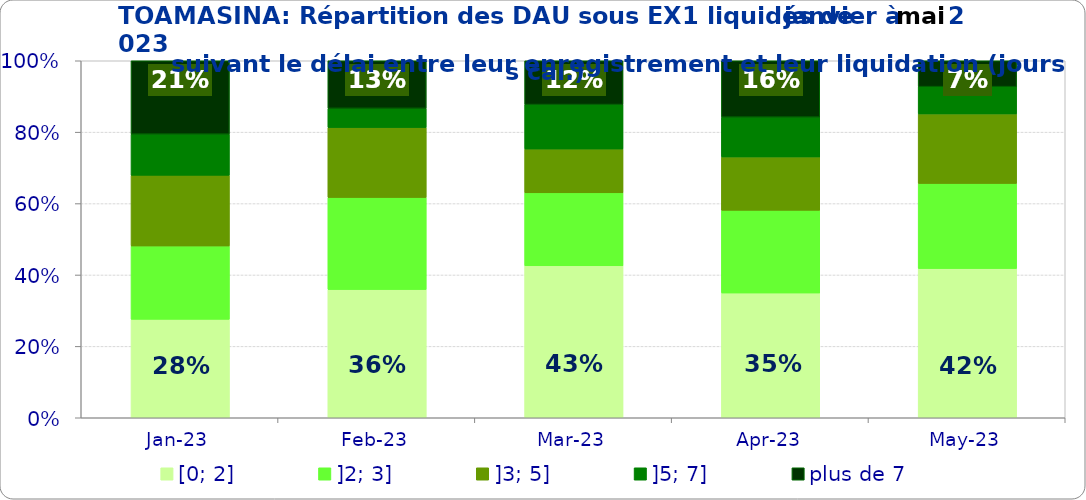
| Category | [0; 2] | ]2; 3] | ]3; 5] | ]5; 7] | plus de 7 |
|---|---|---|---|---|---|
| 2023-01-01 | 0.276 | 0.206 | 0.198 | 0.115 | 0.206 |
| 2023-02-01 | 0.359 | 0.258 | 0.196 | 0.054 | 0.133 |
| 2023-03-01 | 0.426 | 0.204 | 0.123 | 0.125 | 0.123 |
| 2023-04-01 | 0.349 | 0.232 | 0.149 | 0.112 | 0.158 |
| 2023-05-01 | 0.418 | 0.239 | 0.195 | 0.076 | 0.073 |